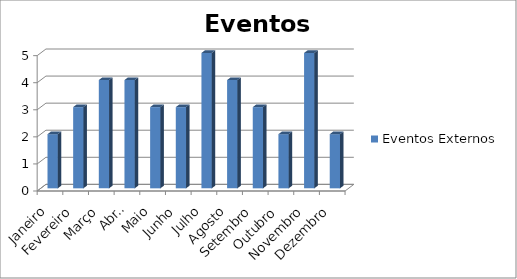
| Category | Eventos Externos |
|---|---|
| Janeiro | 2 |
| Fevereiro | 3 |
| Março | 4 |
| Abril | 4 |
| Maio | 3 |
| Junho | 3 |
| Julho | 5 |
| Agosto | 4 |
| Setembro | 3 |
| Outubro | 2 |
| Novembro | 5 |
| Dezembro | 2 |